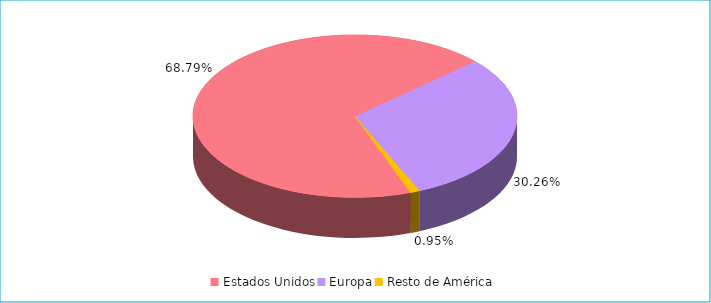
| Category | Series 0 |
|---|---|
| Estados Unidos | 0.688 |
| Europa | 0.303 |
| Resto de América | 0.009 |